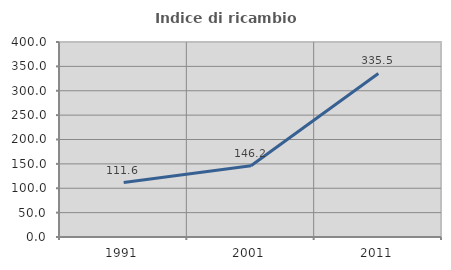
| Category | Indice di ricambio occupazionale  |
|---|---|
| 1991.0 | 111.64 |
| 2001.0 | 146.154 |
| 2011.0 | 335.461 |